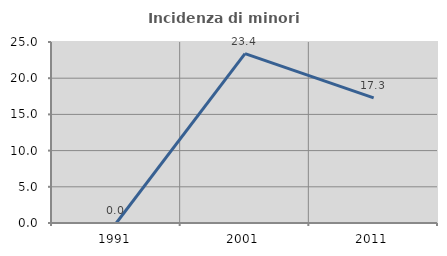
| Category | Incidenza di minori stranieri |
|---|---|
| 1991.0 | 0 |
| 2001.0 | 23.404 |
| 2011.0 | 17.284 |